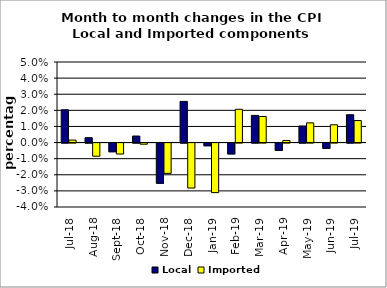
| Category | Local | Imported |
|---|---|---|
| 2018-07-01 | 0.02 | 0.002 |
| 2018-08-01 | 0.003 | -0.008 |
| 2018-09-01 | -0.005 | -0.007 |
| 2018-10-01 | 0.004 | -0.001 |
| 2018-11-01 | -0.025 | -0.019 |
| 2018-12-01 | 0.026 | -0.028 |
| 2019-01-01 | -0.002 | -0.031 |
| 2019-02-01 | -0.007 | 0.021 |
| 2019-03-01 | 0.017 | 0.016 |
| 2019-04-01 | -0.005 | 0.001 |
| 2019-05-01 | 0.01 | 0.012 |
| 2019-06-01 | -0.003 | 0.011 |
| 2019-07-01 | 0.017 | 0.014 |